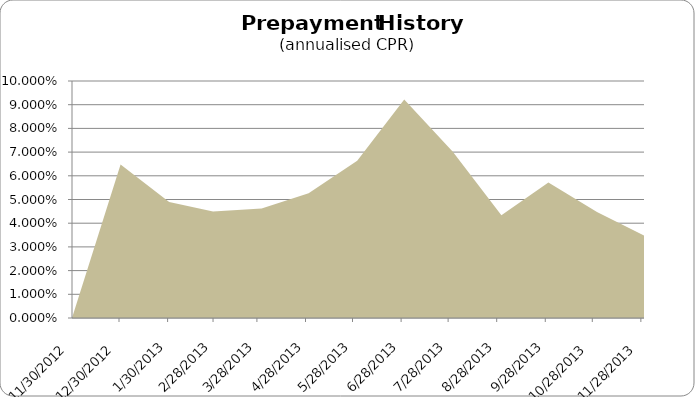
| Category | CPR |
|---|---|
| 11/30/12 | 0 |
| 12/31/12 | 0.065 |
| 1/31/13 | 0.049 |
| 2/28/13 | 0.045 |
| 3/31/13 | 0.046 |
| 4/30/13 | 0.053 |
| 5/31/13 | 0.066 |
| 6/30/13 | 0.092 |
| 7/31/13 | 0.07 |
| 8/31/13 | 0.043 |
| 9/30/13 | 0.057 |
| 10/31/13 | 0.045 |
| 11/30/13 | 0.035 |